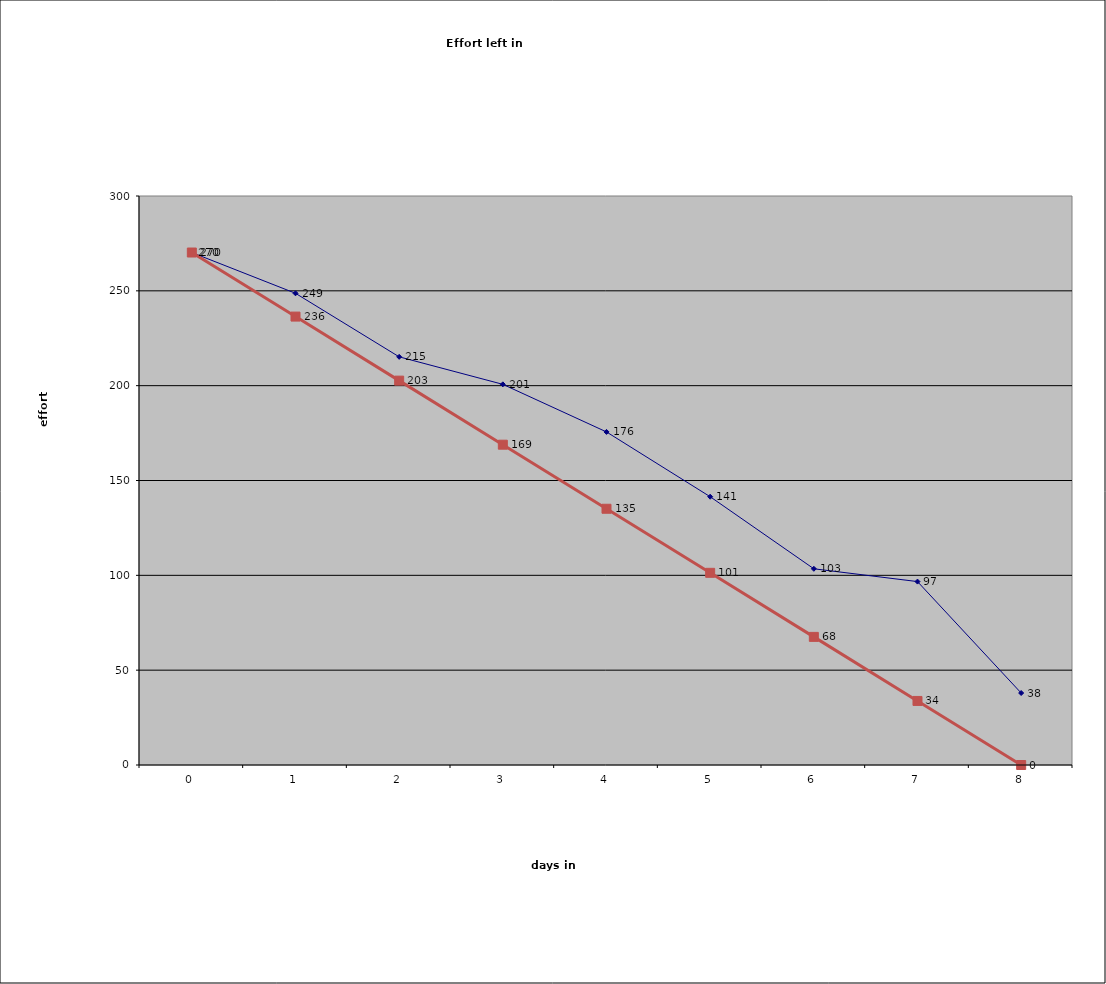
| Category | Effort left, ideal hours | Ideal Velocty |
|---|---|---|
| 0.0 | 270.2 | 270.2 |
| 1.0 | 248.7 | 236.425 |
| 2.0 | 215.2 | 202.65 |
| 3.0 | 200.7 | 168.875 |
| 4.0 | 175.61 | 135.1 |
| 5.0 | 141.45 | 101.325 |
| 6.0 | 103.45 | 67.55 |
| 7.0 | 96.7 | 33.775 |
| 8.0 | 37.95 | 0 |